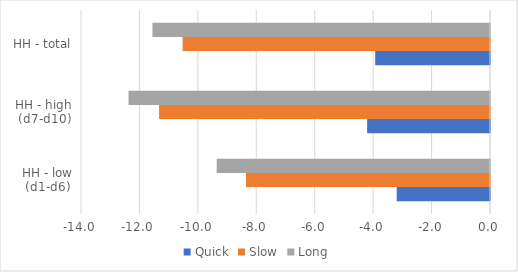
| Category | Quick | Slow | Long |
|---|---|---|---|
| HH - low (d1-d6) | -3.194 | -8.354 | -9.355 |
| HH - high (d7-d10) | -4.206 | -11.327 | -12.374 |
| HH - total | -3.931 | -10.52 | -11.554 |